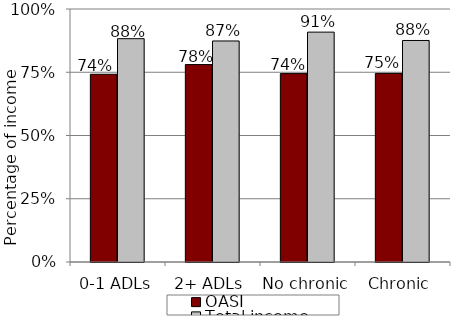
| Category | OASI | Total income |
|---|---|---|
| 0-1 ADLs | 0.742 | 0.883 |
| 2+ ADLs | 0.78 | 0.874 |
| No chronic | 0.745 | 0.909 |
| Chronic | 0.745 | 0.876 |